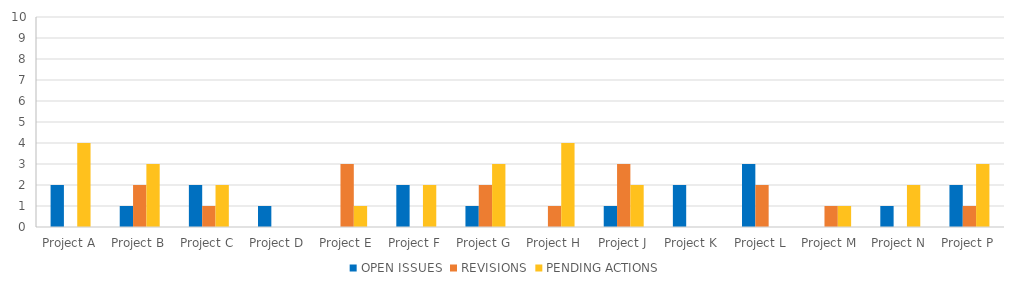
| Category | OPEN ISSUES | REVISIONS | PENDING ACTIONS |
|---|---|---|---|
| Project A | 2 | 0 | 4 |
| Project B | 1 | 2 | 3 |
| Project C | 2 | 1 | 2 |
| Project D | 1 | 0 | 0 |
| Project E | 0 | 3 | 1 |
| Project F | 2 | 0 | 2 |
| Project G | 1 | 2 | 3 |
| Project H | 0 | 1 | 4 |
| Project J | 1 | 3 | 2 |
| Project K | 2 | 0 | 0 |
| Project L | 3 | 2 | 0 |
| Project M | 0 | 1 | 1 |
| Project N | 1 | 0 | 2 |
| Project P | 2 | 1 | 3 |